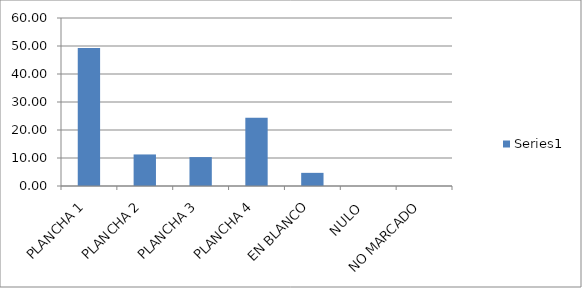
| Category | Series 0 |
|---|---|
| PLANCHA 1 | 49.296 |
| PLANCHA 2 | 11.268 |
| PLANCHA 3 | 10.329 |
| PLANCHA 4 | 24.413 |
| EN BLANCO | 4.695 |
| NULO  | 0 |
| NO MARCADO | 0 |